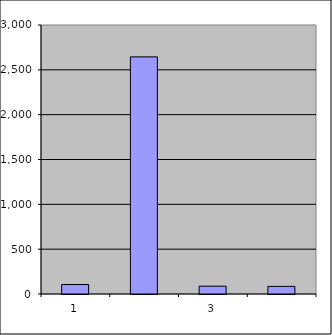
| Category | Series 0 |
|---|---|
| 0 | 105.75 |
| 1 | 2644.608 |
| 2 | 87.255 |
| 3 | 84.909 |